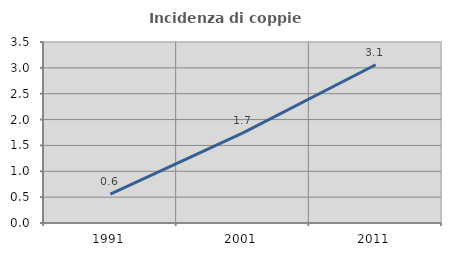
| Category | Incidenza di coppie miste |
|---|---|
| 1991.0 | 0.56 |
| 2001.0 | 1.743 |
| 2011.0 | 3.06 |